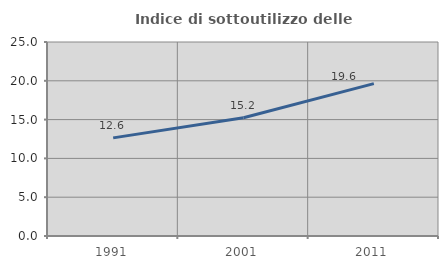
| Category | Indice di sottoutilizzo delle abitazioni  |
|---|---|
| 1991.0 | 12.647 |
| 2001.0 | 15.242 |
| 2011.0 | 19.641 |